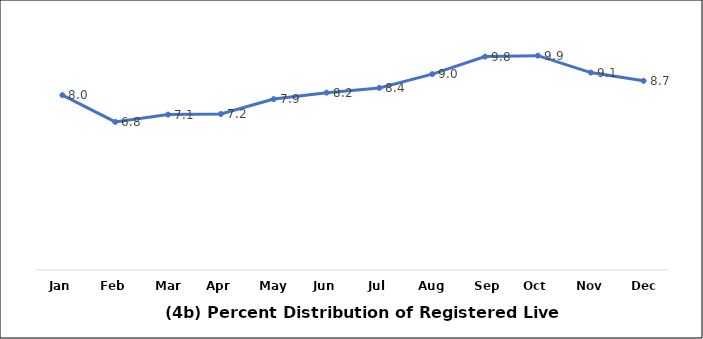
| Category | Series 0 |
|---|---|
| Jan | 8.039 |
| Feb | 6.808 |
| Mar | 7.144 |
| Apr | 7.174 |
| May | 7.859 |
| Jun | 8.154 |
| Jul | 8.373 |
| Aug | 9.008 |
| Sep | 9.811 |
| Oct | 9.855 |
| Nov | 9.077 |
| Dec | 8.697 |